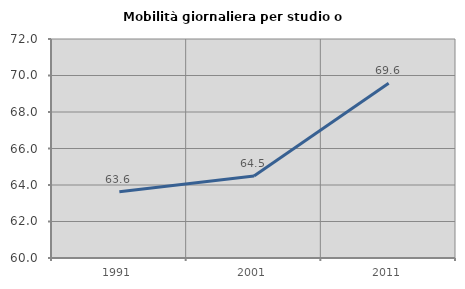
| Category | Mobilità giornaliera per studio o lavoro |
|---|---|
| 1991.0 | 63.629 |
| 2001.0 | 64.495 |
| 2011.0 | 69.573 |